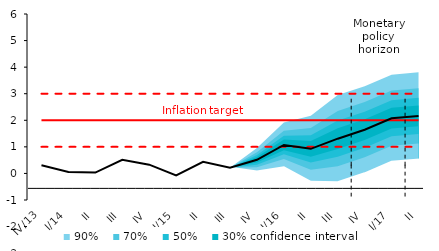
| Category | Inflation Target | Inflation Target - lower bound | Inflation Target - upper bound | Střed předpovědi |
|---|---|---|---|---|
| IV/13 | 2 | 1 | 3 | 0.31 |
| I/14 | 2 | 1 | 3 | 0.053 |
| II | 2 | 1 | 3 | 0.032 |
| III | 2 | 1 | 3 | 0.511 |
| IV | 2 | 1 | 3 | 0.329 |
| I/15 | 2 | 1 | 3 | -0.076 |
| II | 2 | 1 | 3 | 0.439 |
| III | 2 | 1 | 3 | 0.212 |
| IV | 2 | 1 | 3 | 0.514 |
| I/16 | 2 | 1 | 3 | 1.073 |
| II | 2 | 1 | 3 | 0.926 |
| III | 2 | 1 | 3 | 1.308 |
| IV | 2 | 1 | 3 | 1.644 |
| I/17 | 2 | 1 | 3 | 2.078 |
| II | 2 | 1 | 3 | 2.164 |